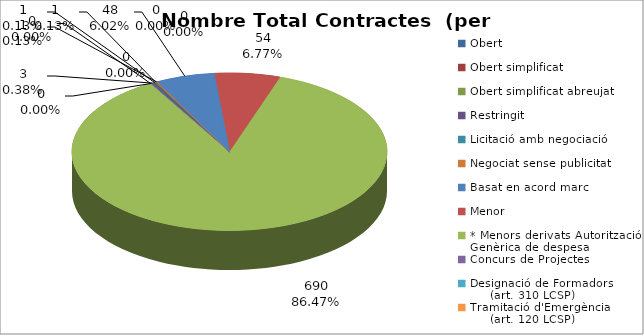
| Category | Nombre Total Contractes |
|---|---|
| Obert | 3 |
| Obert simplificat | 1 |
| Obert simplificat abreujat | 1 |
| Restringit | 0 |
| Licitació amb negociació | 0 |
| Negociat sense publicitat | 1 |
| Basat en acord marc | 48 |
| Menor | 54 |
| * Menors derivats Autorització Genèrica de despesa | 690 |
| Concurs de Projectes | 0 |
| Designació de Formadors
     (art. 310 LCSP) | 0 |
| Tramitació d'Emergència
     (art. 120 LCSP) | 0 |